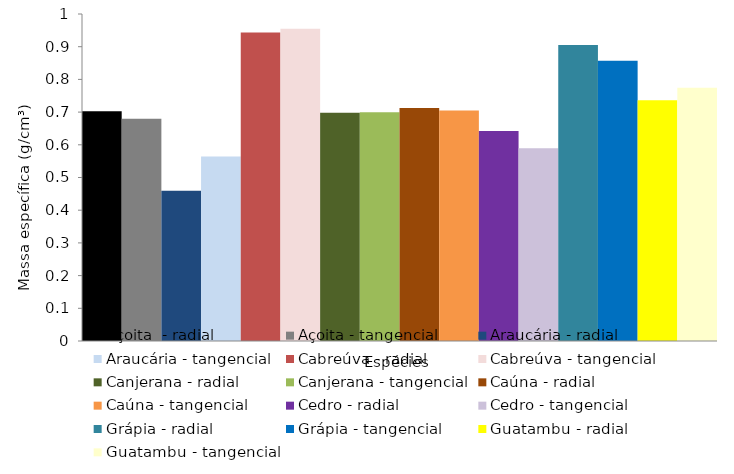
| Category | Açoita  - radial | Açoita - tangencial | Araucária - radial | Araucária - tangencial | Cabreúva - radial | Cabreúva - tangencial | Canjerana - radial | Canjerana - tangencial | Caúna - radial | Caúna - tangencial | Cedro - radial | Cedro - tangencial | Grápia - radial | Grápia - tangencial | Guatambu - radial | Guatambu - tangencial |
|---|---|---|---|---|---|---|---|---|---|---|---|---|---|---|---|---|
| 0 | 0.703 | 0.68 | 0.459 | 0.564 | 0.943 | 0.955 | 0.698 | 0.699 | 0.712 | 0.705 | 0.642 | 0.589 | 0.905 | 0.857 | 0.736 | 0.774 |